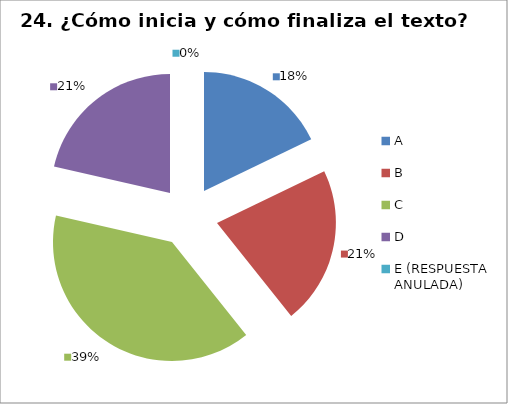
| Category | CANTIDAD DE RESPUESTAS PREGUNTA (23) | PORCENTAJE |
|---|---|---|
| A | 5 | 0.179 |
| B | 6 | 0.214 |
| C | 11 | 0.393 |
| D | 6 | 0.214 |
| E (RESPUESTA ANULADA) | 0 | 0 |